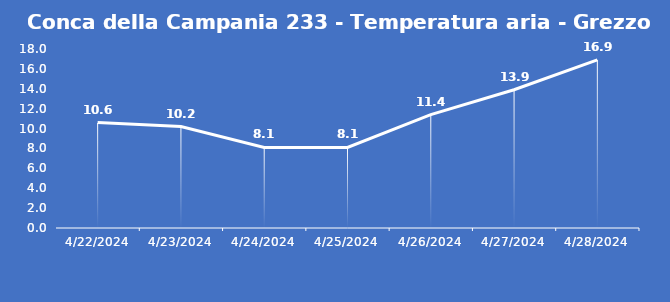
| Category | Conca della Campania 233 - Temperatura aria - Grezzo (°C) |
|---|---|
| 4/22/24 | 10.6 |
| 4/23/24 | 10.2 |
| 4/24/24 | 8.1 |
| 4/25/24 | 8.1 |
| 4/26/24 | 11.4 |
| 4/27/24 | 13.9 |
| 4/28/24 | 16.9 |